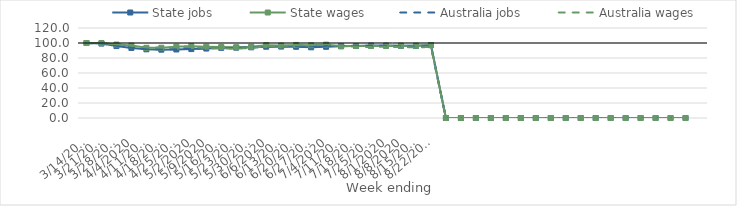
| Category | State jobs | State wages | Australia jobs | Australia wages |
|---|---|---|---|---|
| 14/03/2020 | 100 | 100 | 100 | 100 |
| 21/03/2020 | 99.21 | 100.013 | 99.297 | 99.676 |
| 28/03/2020 | 95.902 | 97.918 | 96.353 | 98.41 |
| 04/04/2020 | 93.412 | 96.53 | 93.695 | 96.734 |
| 11/04/2020 | 91.572 | 93.604 | 91.951 | 94.156 |
| 18/04/2020 | 91.101 | 93.631 | 91.482 | 94.08 |
| 25/04/2020 | 91.356 | 95.154 | 91.798 | 94.248 |
| 02/05/2020 | 91.887 | 95.828 | 92.191 | 94.724 |
| 09/05/2020 | 92.592 | 95.077 | 92.737 | 93.356 |
| 16/05/2020 | 93.535 | 94.649 | 93.262 | 92.686 |
| 23/05/2020 | 93.756 | 94.341 | 93.563 | 92.308 |
| 30/05/2020 | 94.233 | 94.88 | 94.077 | 93.6 |
| 06/06/2020 | 95.024 | 97.147 | 95.016 | 95.393 |
| 13/06/2020 | 95.226 | 96.643 | 95.489 | 96.094 |
| 20/06/2020 | 94.939 | 97.431 | 95.696 | 96.969 |
| 27/06/2020 | 94.263 | 96.897 | 95.581 | 96.996 |
| 04/07/2020 | 94.922 | 97.801 | 96.174 | 98.514 |
| 11/07/2020 | 95.593 | 95.944 | 96.395 | 95.769 |
| 18/07/2020 | 95.939 | 95.986 | 96.226 | 95.048 |
| 25/07/2020 | 96.564 | 95.999 | 96.271 | 94.643 |
| 01/08/2020 | 96.54 | 96.031 | 96.155 | 94.947 |
| 08/08/2020 | 96.168 | 96.321 | 95.543 | 94.567 |
| 15/08/2020 | 96.182 | 96.293 | 95.204 | 94.097 |
| 22/08/2020 | 97.181 | 97.083 | 95.812 | 94.778 |